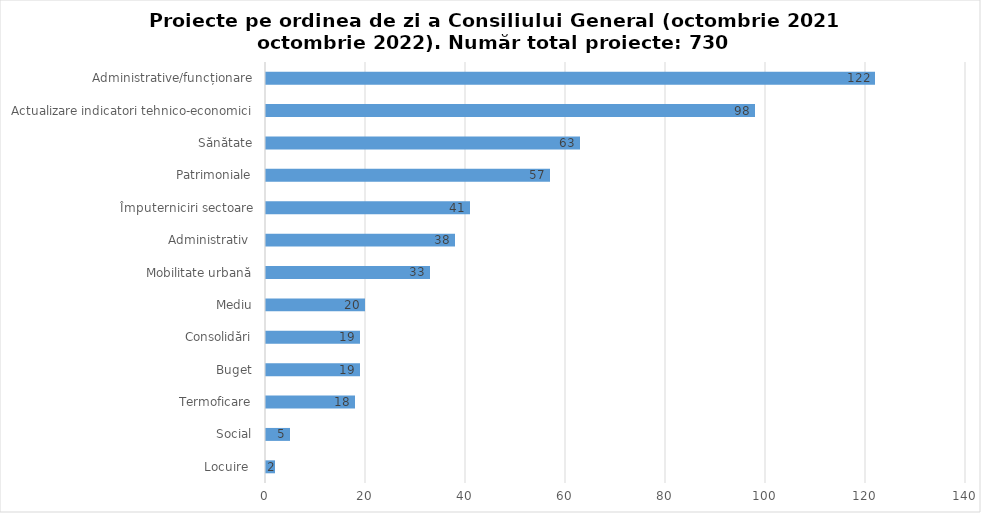
| Category | Series 0 |
|---|---|
| Locuire  | 2 |
| Social | 5 |
| Termoficare | 18 |
| Buget | 19 |
| Consolidări | 19 |
| Mediu | 20 |
| Mobilitate urbană | 33 |
| Administrativ  | 38 |
| Împuterniciri sectoare | 41 |
| Patrimoniale | 57 |
| Sănătate | 63 |
| Actualizare indicatori tehnico-economici | 98 |
| Administrative/funcționare | 122 |